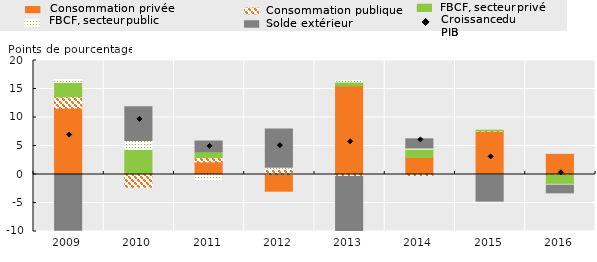
| Category | Consommation privée | Consommation publique | FBCF, secteur privé | FBCF, secteur public | Solde extérieur |
|---|---|---|---|---|---|
| 2009.0 | 11.65 | 1.96 | 2.54 | 0.53 | -9.76 |
| 2010.0 | 0.2 | -2.24 | 4.19 | 1.59 | 5.91 |
| 2011.0 | 2.2 | 0.75 | 1.04 | -0.94 | 1.89 |
| 2012.0 | -2.93 | 0.87 | 0.02 | 0.38 | 6.71 |
| 2013.0 | 15.55 | -0.35 | 0.67 | 0.24 | -10.36 |
| 2014.0 | 2.99 | -0.18 | 1.46 | 0.19 | 1.62 |
| 2015.0 | 7.57 | 0.06 | 0.14 | -0.07 | -4.61 |
| 2016.0 | 3.53 | -0.08 | -1.64 | -0.13 | -1.37 |